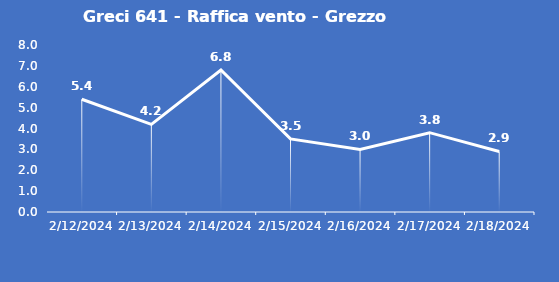
| Category | Greci 641 - Raffica vento - Grezzo (m/s) |
|---|---|
| 2/12/24 | 5.4 |
| 2/13/24 | 4.2 |
| 2/14/24 | 6.8 |
| 2/15/24 | 3.5 |
| 2/16/24 | 3 |
| 2/17/24 | 3.8 |
| 2/18/24 | 2.9 |